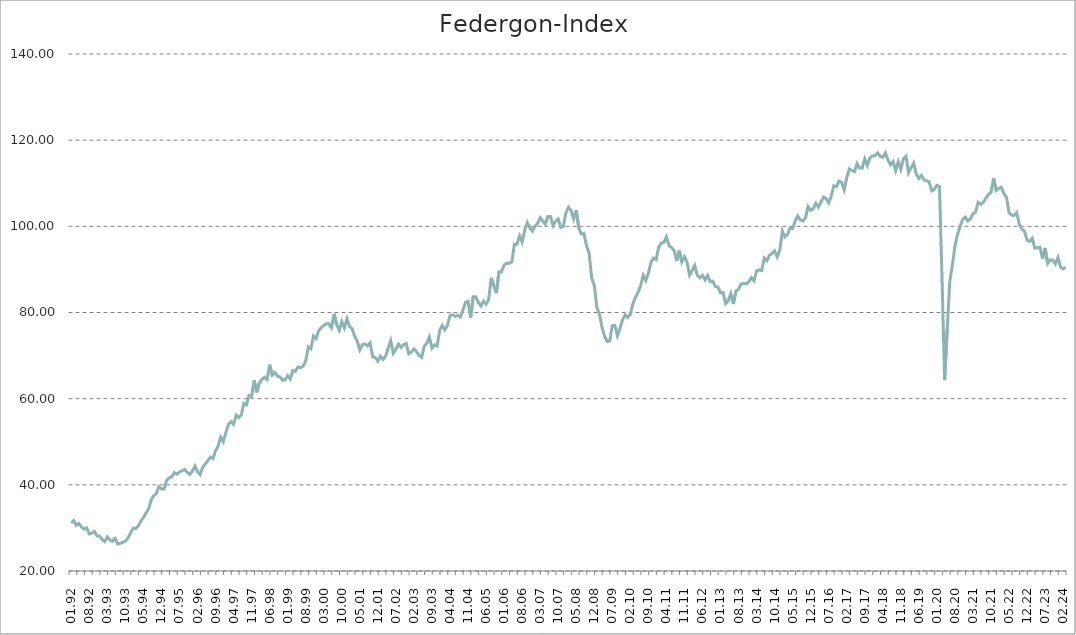
| Category | Federgon-Index |
|---|---|
| 01.92 | 31.167 |
| 02.92 | 31.728 |
| 03.92 | 30.608 |
| 04.92 | 31.019 |
| 05.92 | 30.182 |
| 06.92 | 29.735 |
| 07.92 | 29.992 |
| 08.92 | 28.619 |
| 09.92 | 28.833 |
| 10.92 | 29.184 |
| 11.92 | 28.137 |
| 12.92 | 28.107 |
| 01.93 | 27.267 |
| 02.93 | 26.809 |
| 03.93 | 27.931 |
| 04.93 | 27.129 |
| 05.93 | 26.939 |
| 06.93 | 27.56 |
| 07.93 | 26.282 |
| 08.93 | 26.404 |
| 09.93 | 26.678 |
| 10.93 | 26.921 |
| 11.93 | 27.653 |
| 12.93 | 28.859 |
| 01.94 | 29.906 |
| 02.94 | 29.87 |
| 03.94 | 30.425 |
| 04.94 | 31.586 |
| 05.94 | 32.356 |
| 06.94 | 33.491 |
| 07.94 | 34.358 |
| 08.94 | 36.482 |
| 09.94 | 37.47 |
| 10.94 | 37.935 |
| 11.94 | 39.579 |
| 12.94 | 39.053 |
| 01.95 | 39.03 |
| 02.95 | 40.967 |
| 03.95 | 41.65 |
| 04.95 | 41.835 |
| 05.95 | 42.839 |
| 06.95 | 42.443 |
| 07.95 | 42.966 |
| 08.95 | 43.252 |
| 09.95 | 43.584 |
| 10.95 | 42.887 |
| 11.95 | 42.398 |
| 12.95 | 43.206 |
| 01.96 | 44.363 |
| 02.96 | 43.023 |
| 03.96 | 42.379 |
| 04.96 | 44.078 |
| 05.96 | 44.86 |
| 06.96 | 45.603 |
| 07.96 | 46.449 |
| 08.96 | 46.123 |
| 09.96 | 47.899 |
| 10.96 | 49.014 |
| 11.96 | 51.082 |
| 12.96 | 50.002 |
| 01.97 | 52.164 |
| 02.97 | 54.029 |
| 03.97 | 54.681 |
| 04.97 | 54.062 |
| 05.97 | 56.159 |
| 06.97 | 55.579 |
| 07.97 | 56.28 |
| 08.97 | 58.938 |
| 09.97 | 58.564 |
| 10.97 | 60.734 |
| 11.97 | 60.493 |
| 12.97 | 64.304 |
| 01.98 | 61.458 |
| 02.98 | 63.652 |
| 03.98 | 64.494 |
| 04.98 | 64.944 |
| 05.98 | 64.409 |
| 06.98 | 67.894 |
| 07.98 | 65.434 |
| 08.98 | 66.078 |
| 09.98 | 65.246 |
| 10.98 | 65.05 |
| 11.98 | 64.273 |
| 12.98 | 64.33 |
| 01.99 | 65.342 |
| 02.99 | 64.561 |
| 03.99 | 66.536 |
| 04.99 | 66.349 |
| 05.99 | 67.374 |
| 06.99 | 67.18 |
| 07.99 | 67.554 |
| 08.99 | 68.74 |
| 09.99 | 72.029 |
| 10.99 | 71.583 |
| 11.99 | 74.553 |
| 12.99 | 73.926 |
| 01.00 | 75.738 |
| 02.00 | 76.478 |
| 03.00 | 77.007 |
| 04.00 | 77.362 |
| 05.00 | 77.382 |
| 06.00 | 76.458 |
| 07.00 | 79.701 |
| 08.00 | 77.169 |
| 09.00 | 75.875 |
| 10.00 | 77.908 |
| 11.00 | 76.432 |
| 12.00 | 78.553 |
| 01.01 | 76.736 |
| 02.01 | 76.268 |
| 03.01 | 74.465 |
| 04.01 | 73.335 |
| 05.01 | 71.329 |
| 06.01 | 72.564 |
| 07.01 | 72.718 |
| 08.01 | 72.248 |
| 09.01 | 72.957 |
| 10.01 | 69.698 |
| 11.01 | 69.537 |
| 12.01 | 68.711 |
| 01.02 | 69.883 |
| 02.02 | 69.083 |
| 03.02 | 69.842 |
| 04.02 | 71.685 |
| 05.02 | 73.457 |
| 06.02 | 70.523 |
| 07.02 | 71.456 |
| 08.02 | 72.681 |
| 09.02 | 71.895 |
| 10.02 | 72.542 |
| 11.02 | 72.817 |
| 12.02 | 70.402 |
| 01.03 | 70.825 |
| 02.03 | 71.564 |
| 03.03 | 70.905 |
| 04.03 | 70.02 |
| 05.03 | 69.585 |
| 06.03 | 72.177 |
| 07.03 | 72.864 |
| 08.03 | 74.338 |
| 09.03 | 71.736 |
| 10.03 | 72.487 |
| 11.03 | 72.2 |
| 12.03 | 75.86 |
| 01.04 | 77.012 |
| 02.04 | 75.985 |
| 03.04 | 76.945 |
| 04.04 | 79.293 |
| 05.04 | 79.5 |
| 06.04 | 79.089 |
| 07.04 | 79.343 |
| 08.04 | 78.935 |
| 09.04 | 80.489 |
| 10.04 | 82.326 |
| 11.04 | 82.592 |
| 12.04 | 78.784 |
| 01.05 | 83.634 |
| 02.05 | 83.639 |
| 03.05 | 82.322 |
| 04.05 | 81.542 |
| 05.05 | 82.594 |
| 06.05 | 81.945 |
| 07.05 | 82.988 |
| 08.05 | 88.034 |
| 09.05 | 86.185 |
| 10.05 | 84.473 |
| 11.05 | 89.468 |
| 12.05 | 89.455 |
| 01.06 | 91.008 |
| 02.06 | 91.473 |
| 03.06 | 91.388 |
| 04.06 | 91.762 |
| 05.06 | 95.852 |
| 06.06 | 95.839 |
| 07.06 | 97.774 |
| 08.06 | 96.346 |
| 09.06 | 99.059 |
| 10.06 | 100.883 |
| 11.06 | 99.644 |
| 12.06 | 98.901 |
| 01.07 | 100 |
| 02.07 | 100.669 |
| 03.07 | 102.015 |
| 04.07 | 101.299 |
| 05.07 | 100.488 |
| 06.07 | 102.3 |
| 07.07 | 102.284 |
| 08.07 | 100.176 |
| 09.07 | 101.198 |
| 10.07 | 101.716 |
| 11.07 | 99.73 |
| 12.07 | 99.983 |
| 01.08 | 103.163 |
| 02.08 | 104.423 |
| 03.08 | 103.686 |
| 04.08 | 101.683 |
| 05.08 | 103.779 |
| 06.08 | 99.581 |
| 07.08 | 98.212 |
| 08.08 | 98.381 |
| 09.08 | 95.47 |
| 10.08 | 93.726 |
| 11.08 | 87.985 |
| 12.08 | 86.312 |
| 01.09 | 81.176 |
| 02.09 | 79.711 |
| 03.09 | 76.556 |
| 04.09 | 74.524 |
| 05.09 | 73.272 |
| 06.09 | 73.4 |
| 07.09 | 76.943 |
| 08.09 | 76.958 |
| 09.09 | 74.586 |
| 10.09 | 76.356 |
| 11.09 | 78.307 |
| 12.09 | 79.504 |
| 01.10 | 78.859 |
| 02.10 | 79.552 |
| 03.10 | 82.005 |
| 04.10 | 83.572 |
| 05.10 | 84.682 |
| 06.10 | 86.227 |
| 07.10 | 88.629 |
| 08.10 | 87.4 |
| 09.10 | 89.119 |
| 10.10 | 91.642 |
| 11.10 | 92.631 |
| 12.10 | 92.301 |
| 01.11 | 95.138 |
| 02.11 | 96.136 |
| 03.11 | 96.248 |
| 04.11 | 97.552 |
| 05.11 | 95.554 |
| 06.11 | 95.107 |
| 07.11 | 94.347 |
| 08.11 | 91.99 |
| 09.11 | 94.388 |
| 10.11 | 91.754 |
| 11.11 | 92.944 |
| 12.11 | 91.702 |
| 01.12 | 88.691 |
| 02.12 | 89.705 |
| 03.12 | 90.911 |
| 04.12 | 88.604 |
| 05.12 | 88.03 |
| 06.12 | 88.647 |
| 07.12 | 87.556 |
| 08.12 | 88.589 |
| 09.12 | 87.213 |
| 10.12 | 87.288 |
| 11.12 | 86.041 |
| 12.12 | 85.926 |
| 01.13 | 84.565 |
| 02.13 | 84.609 |
| 03.13 | 82.046 |
| 04.13 | 82.736 |
| 05.13 | 84.366 |
| 06.13 | 81.972 |
| 07.13 | 85.011 |
| 08.13 | 85.415 |
| 09.13 | 86.61 |
| 10.13 | 86.736 |
| 11.13 | 86.645 |
| 12.13 | 87.14 |
| 01.14 | 88.1 |
| 02.14 | 87.369 |
| 03.14 | 89.637 |
| 04.14 | 89.892 |
| 05.14 | 89.739 |
| 06.14 | 92.634 |
| 07.14 | 91.981 |
| 08.14 | 93.28 |
| 09.14 | 93.683 |
| 10.14 | 94.294 |
| 11.14 | 92.904 |
| 12.14 | 94.397 |
| 01.15 | 98.948 |
| 02.15 | 97.546 |
| 03.15 | 98.141 |
| 04.15 | 99.62 |
| 05.15 | 99.48 |
| 06.15 | 101.221 |
| 07.15 | 102.449 |
| 08.15 | 101.486 |
| 09.15 | 101.257 |
| 10.15 | 101.953 |
| 11.15 | 104.595 |
| 12.15 | 103.704 |
| 01.16 | 104.069 |
| 02.16 | 105.363 |
| 03.16 | 104.443 |
| 04.16 | 105.597 |
| 05.16 | 106.782 |
| 06.16 | 106.42 |
| 07.16 | 105.466 |
| 08.16 | 107.036 |
| 09.16 | 109.412 |
| 10.16 | 109.193 |
| 11.16 | 110.515 |
| 12.16 | 110.172 |
| 01.17 | 108.463 |
| 02.17 | 111.278 |
| 03.17 | 113.329 |
| 04.17 | 112.969 |
| 05.17 | 112.69 |
| 06.17 | 114.556 |
| 07.17 | 113.521 |
| 08.17 | 113.5 |
| 09.17 | 115.66 |
| 10.17 | 114.158 |
| 11.17 | 115.899 |
| 12.17 | 116.339 |
| 01.18 | 116.428 |
| 02.18 | 117.063 |
| 03.18 | 116.213 |
| 04.18 | 116.021 |
| 05.18 | 117.031 |
| 06.18 | 115.378 |
| 07.18 | 114.296 |
| 08.18 | 115.016 |
| 09.18 | 112.938 |
| 10.18 | 115.044 |
| 11.18 | 113.247 |
| 12.18 | 115.69 |
| 01.19 | 116.287 |
| 02.19 | 112.423 |
| 03.19 | 113.606 |
| 04.19 | 114.683 |
| 05.19 | 112.123 |
| 06.19 | 111.114 |
| 07.19 | 111.821 |
| 08.19 | 110.77 |
| 09.19 | 110.613 |
| 10.19 | 110.267 |
| 11.19 | 108.226 |
| 12.19 | 108.587 |
| 01.20 | 109.512 |
| 02.20 | 109.268 |
| 03.20 | 87.704 |
| 04.20 | 64.311 |
| 05.20 | 76.257 |
| 06.20 | 87.176 |
| 07.20 | 91.004 |
| 08.20 | 95.362 |
| 09.20 | 98.119 |
| 10.20 | 99.992 |
| 11.20 | 101.615 |
| 12.20 | 102.146 |
| 01.21 | 101.243 |
| 02.21 | 101.714 |
| 03.21 | 102.89 |
| 04.21 | 103.293 |
| 05.21 | 105.582 |
| 06.21 | 105.13 |
| 07.21 | 105.573 |
| 08.21 | 106.575 |
| 09.21 | 107.412 |
| 10.21 | 107.837 |
| 11.21 | 111.158 |
| 12.21 | 108.339 |
| 01.22 | 108.839 |
| 02.22 | 109.079 |
| 03.22 | 107.586 |
| 04.22 | 106.797 |
| 05.22 | 103.117 |
| 06.22 | 102.611 |
| 07.22 | 102.527 |
| 08.22 | 103.188 |
| 09.22 | 100.416 |
| 10.22 | 99.369 |
| 11.22 | 98.827 |
| 12.22 | 96.823 |
| 01.23 | 96.48 |
| 02.23 | 97.235 |
| 03.23 | 94.928 |
| 04.23 | 95.043 |
| 05.23 | 95.108 |
| 06.23 | 92.537 |
| 07.23 | 94.984 |
| 08.23 | 91.381 |
| 09.23 | 92.206 |
| 10.23 | 92.146 |
| 11.23 | 91.244 |
| 12.23 | 92.802 |
| 01.24 | 90.55 |
| 02.24 | 90.131 |
| 03.24 | 90.486 |